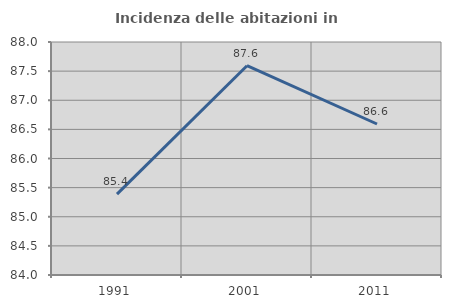
| Category | Incidenza delle abitazioni in proprietà  |
|---|---|
| 1991.0 | 85.388 |
| 2001.0 | 87.593 |
| 2011.0 | 86.592 |